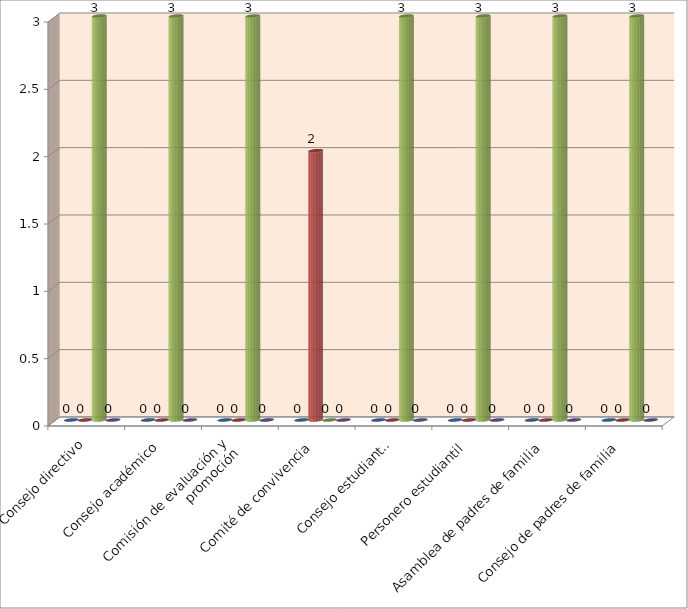
| Category | Series 0 | Series 1 | Series 2 | Series 3 |
|---|---|---|---|---|
| Consejo directivo | 0 | 0 | 3 | 0 |
| Consejo académico | 0 | 0 | 3 | 0 |
| Comisión de evaluación y
promoción | 0 | 0 | 3 | 0 |
| Comité de convivencia | 0 | 2 | 0 | 0 |
| Consejo estudiantil | 0 | 0 | 3 | 0 |
| Personero estudiantil | 0 | 0 | 3 | 0 |
| Asamblea de padres de familia | 0 | 0 | 3 | 0 |
| Consejo de padres de familia | 0 | 0 | 3 | 0 |